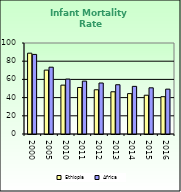
| Category | Ethiopia | Africa |
|---|---|---|
| 2000.0 | 88.8 | 87.462 |
| 2005.0 | 70.2 | 73.418 |
| 2010.0 | 53.7 | 60.345 |
| 2011.0 | 51.1 | 58.107 |
| 2012.0 | 48.6 | 56.032 |
| 2013.0 | 46.4 | 54.131 |
| 2014.0 | 44.4 | 52.336 |
| 2015.0 | 42.6 | 50.754 |
| 2016.0 | 41 | 49.283 |